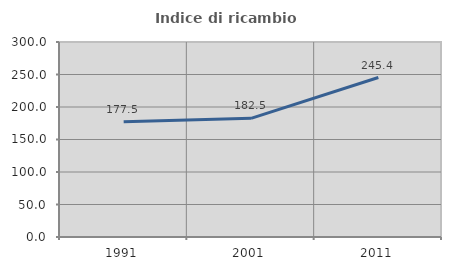
| Category | Indice di ricambio occupazionale  |
|---|---|
| 1991.0 | 177.459 |
| 2001.0 | 182.52 |
| 2011.0 | 245.361 |